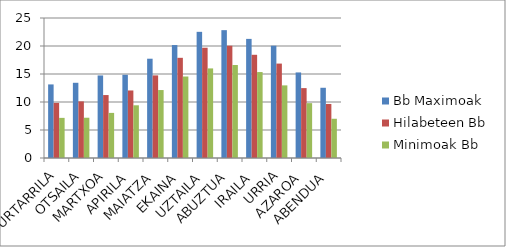
| Category | Bb Maximoak | Hilabeteen Bb | Minimoak Bb |
|---|---|---|---|
| URTARRILA | 13.14 | 9.84 | 7.166 |
| OTSAILA | 13.43 | 10.11 | 7.192 |
| MARTXOA | 14.74 | 11.24 | 8.056 |
| APIRILA | 14.86 | 12.06 | 9.412 |
| MAIATZA | 17.73 | 14.75 | 12.135 |
| EKAINA | 20.17 | 17.89 | 14.551 |
| UZTAILA | 22.53 | 19.69 | 15.998 |
| ABUZTUA | 22.83 | 20.05 | 16.605 |
| IRAILA | 21.27 | 18.43 | 15.348 |
| URRIA | 20.05 | 16.86 | 12.968 |
| AZAROA | 15.28 | 12.48 | 9.794 |
| ABENDUA | 12.54 | 9.65 | 7.007 |